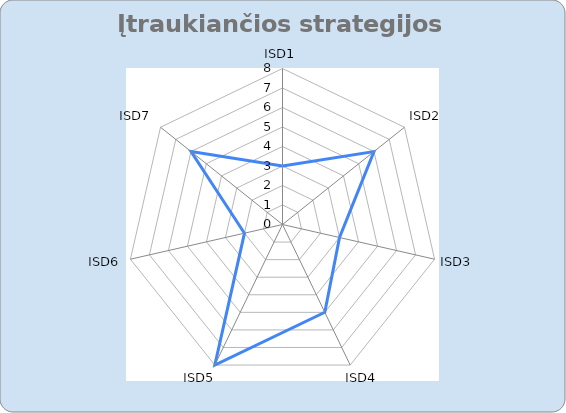
| Category | Series 0 |
|---|---|
| ISD1 | 3 |
| ISD2 | 6 |
| ISD3 | 3 |
| ISD4 | 5 |
| ISD5 | 8 |
| ISD6 | 2 |
| ISD7 | 6 |